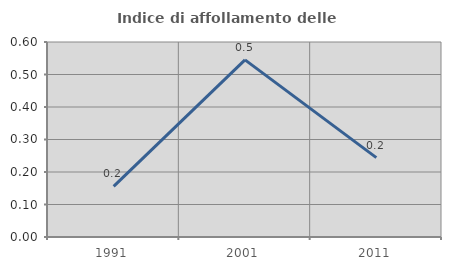
| Category | Indice di affollamento delle abitazioni  |
|---|---|
| 1991.0 | 0.156 |
| 2001.0 | 0.545 |
| 2011.0 | 0.244 |